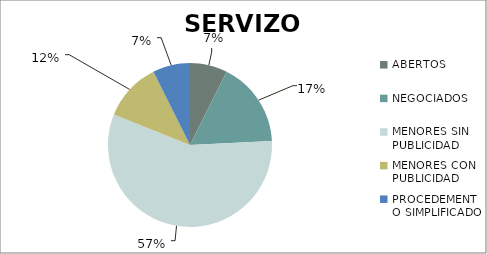
| Category | Series 0 |
|---|---|
| ABERTOS  | 7 |
| NEGOCIADOS  | 16 |
| MENORES SIN PUBLICIDAD | 54 |
| MENORES CON PUBLICIDAD | 11 |
| PROCEDEMENTO SIMPLIFICADO | 7 |